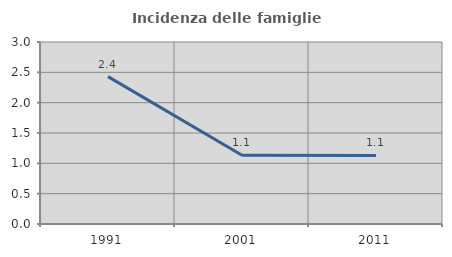
| Category | Incidenza delle famiglie numerose |
|---|---|
| 1991.0 | 2.429 |
| 2001.0 | 1.134 |
| 2011.0 | 1.131 |